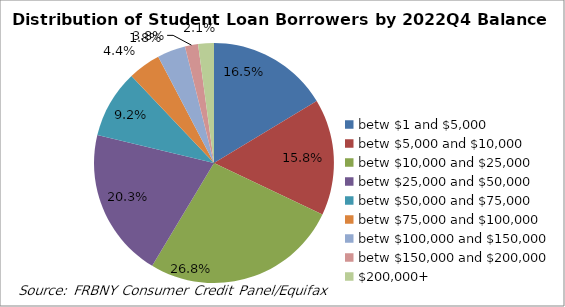
| Category | Series 0 |
|---|---|
| betw $1 and $5,000 | 0.165 |
| betw $5,000 and $10,000 | 0.158 |
| betw $10,000 and $25,000 | 0.268 |
| betw $25,000 and $50,000 | 0.203 |
| betw $50,000 and $75,000 | 0.092 |
| betw $75,000 and $100,000 | 0.044 |
| betw $100,000 and $150,000 | 0.038 |
| betw $150,000 and $200,000 | 0.018 |
| $200,000+ | 0.021 |